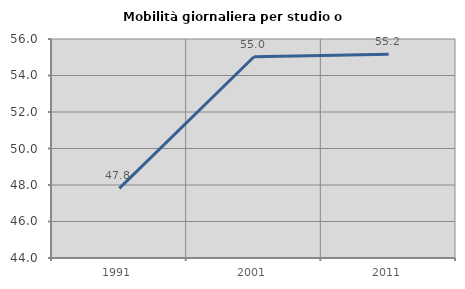
| Category | Mobilità giornaliera per studio o lavoro |
|---|---|
| 1991.0 | 47.814 |
| 2001.0 | 55.025 |
| 2011.0 | 55.169 |